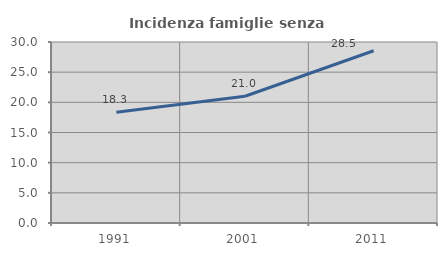
| Category | Incidenza famiglie senza nuclei |
|---|---|
| 1991.0 | 18.349 |
| 2001.0 | 21.003 |
| 2011.0 | 28.544 |